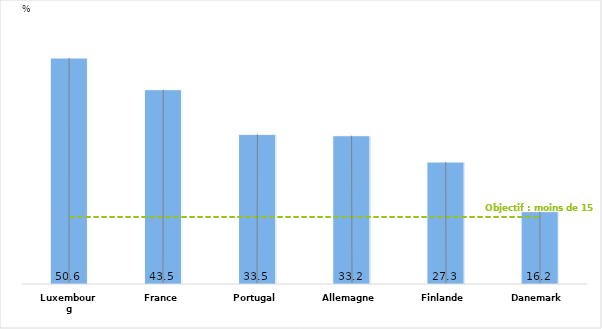
| Category | Total |
|---|---|
| Luxembourg | 50.6 |
| France | 43.5 |
| Portugal | 33.5 |
| Allemagne | 33.2 |
| Finlande | 27.3 |
| Danemark | 16.2 |